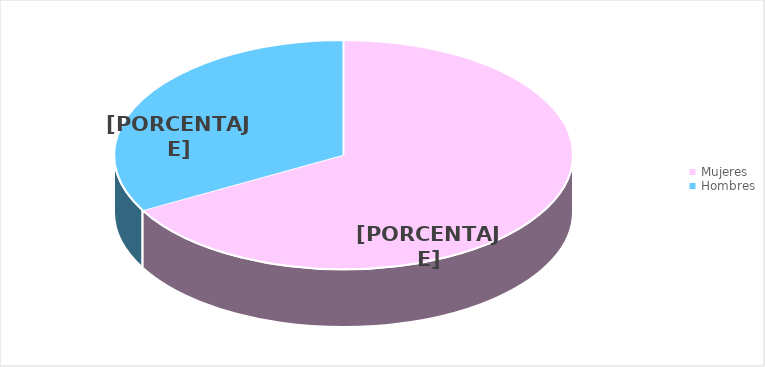
| Category | Series 0 |
|---|---|
| Mujeres | 1352 |
| Hombres | 667 |